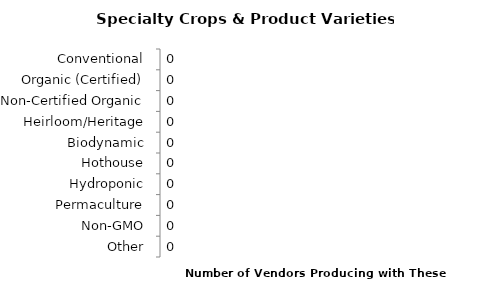
| Category | Series 0 |
|---|---|
| Conventional | 0 |
| Organic (Certified) | 0 |
| Non-Certified Organic | 0 |
| Heirloom/Heritage | 0 |
| Biodynamic | 0 |
| Hothouse | 0 |
| Hydroponic | 0 |
| Permaculture | 0 |
| Non-GMO | 0 |
| Other | 0 |